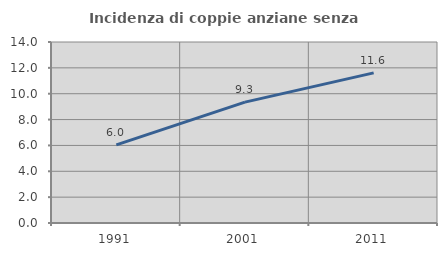
| Category | Incidenza di coppie anziane senza figli  |
|---|---|
| 1991.0 | 6.04 |
| 2001.0 | 9.347 |
| 2011.0 | 11.611 |